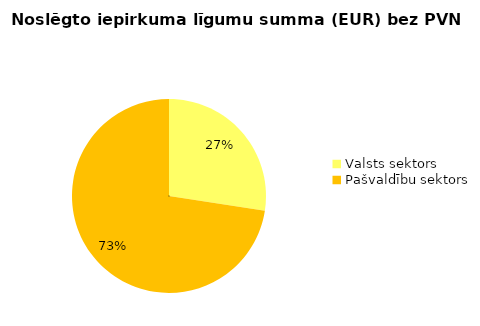
| Category | Noslēgto iepirkuma līgumu summa (EUR) bez PVN |
|---|---|
| Valsts sektors | 1524780 |
| Pašvaldību sektors | 4033952 |